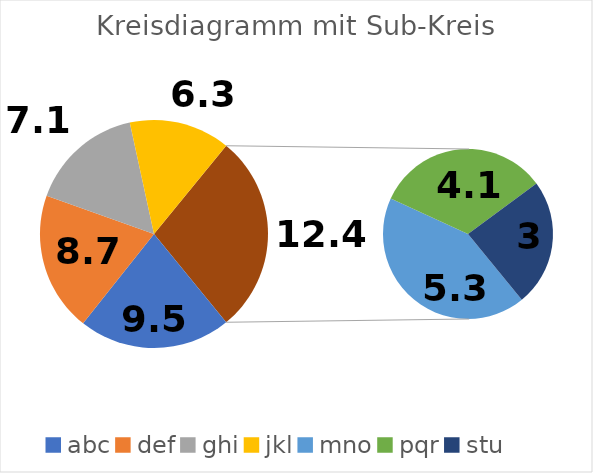
| Category | X |
|---|---|
| abc | 9.5 |
| def | 8.7 |
| ghi | 7.1 |
| jkl | 6.3 |
| mno | 5.3 |
| pqr | 4.1 |
| stu | 3 |